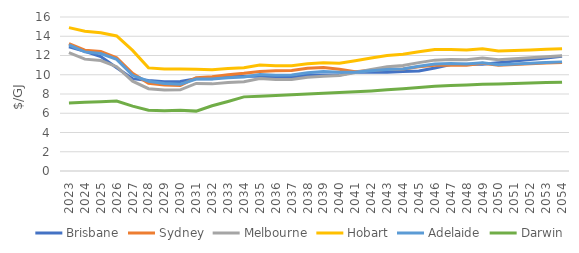
| Category | Brisbane | Sydney | Melbourne | Hobart | Adelaide | Darwin |
|---|---|---|---|---|---|---|
| 2023.0 | 12.893 | 13.239 | 12.304 | 14.9 | 13.096 | 7.075 |
| 2024.0 | 12.424 | 12.55 | 11.621 | 14.52 | 12.376 | 7.14 |
| 2025.0 | 11.897 | 12.408 | 11.471 | 14.37 | 12.208 | 7.206 |
| 2026.0 | 10.728 | 11.772 | 10.838 | 14.027 | 11.597 | 7.272 |
| 2027.0 | 9.595 | 10.146 | 9.338 | 12.527 | 9.94 | 6.734 |
| 2028.0 | 9.41 | 9.122 | 8.554 | 10.714 | 9.325 | 6.312 |
| 2029.0 | 9.28 | 8.945 | 8.419 | 10.592 | 9.086 | 6.251 |
| 2030.0 | 9.31 | 8.888 | 8.428 | 10.6 | 9.008 | 6.319 |
| 2031.0 | 9.577 | 9.694 | 9.102 | 10.568 | 9.559 | 6.222 |
| 2032.0 | 9.588 | 9.802 | 9.052 | 10.523 | 9.564 | 6.781 |
| 2033.0 | 9.846 | 9.995 | 9.203 | 10.658 | 9.7 | 7.228 |
| 2034.0 | 9.846 | 10.147 | 9.283 | 10.731 | 9.776 | 7.702 |
| 2035.0 | 9.838 | 10.343 | 9.606 | 11.021 | 10.019 | 7.774 |
| 2036.0 | 9.785 | 10.41 | 9.502 | 10.927 | 9.948 | 7.848 |
| 2037.0 | 9.715 | 10.45 | 9.518 | 10.942 | 9.975 | 7.922 |
| 2038.0 | 9.965 | 10.668 | 9.732 | 11.134 | 10.216 | 7.996 |
| 2039.0 | 9.965 | 10.755 | 9.853 | 11.243 | 10.338 | 8.072 |
| 2040.0 | 9.965 | 10.56 | 9.914 | 11.191 | 10.254 | 8.148 |
| 2041.0 | 10.284 | 10.321 | 10.224 | 11.462 | 10.25 | 8.225 |
| 2042.0 | 10.268 | 10.466 | 10.538 | 11.745 | 10.418 | 8.322 |
| 2043.0 | 10.268 | 10.579 | 10.824 | 12.003 | 10.539 | 8.437 |
| 2044.0 | 10.329 | 10.61 | 10.959 | 12.124 | 10.605 | 8.545 |
| 2045.0 | 10.396 | 10.827 | 11.258 | 12.394 | 10.889 | 8.678 |
| 2046.0 | 10.704 | 10.987 | 11.519 | 12.628 | 11.125 | 8.8 |
| 2047.0 | 11.054 | 11.014 | 11.577 | 12.635 | 11.166 | 8.876 |
| 2048.0 | 11.092 | 10.991 | 11.553 | 12.569 | 11.117 | 8.945 |
| 2049.0 | 11.094 | 11.187 | 11.75 | 12.702 | 11.246 | 9.006 |
| 2050.0 | 11.254 | 10.992 | 11.568 | 12.461 | 11.049 | 9.051 |
| 2051.0 | 11.416 | 11.064 | 11.668 | 12.522 | 11.12 | 9.096 |
| 2052.0 | 11.58 | 11.137 | 11.768 | 12.584 | 11.192 | 9.142 |
| 2053.0 | 11.747 | 11.21 | 11.869 | 12.646 | 11.265 | 9.188 |
| 2054.0 | 11.916 | 11.283 | 11.97 | 12.708 | 11.338 | 9.234 |